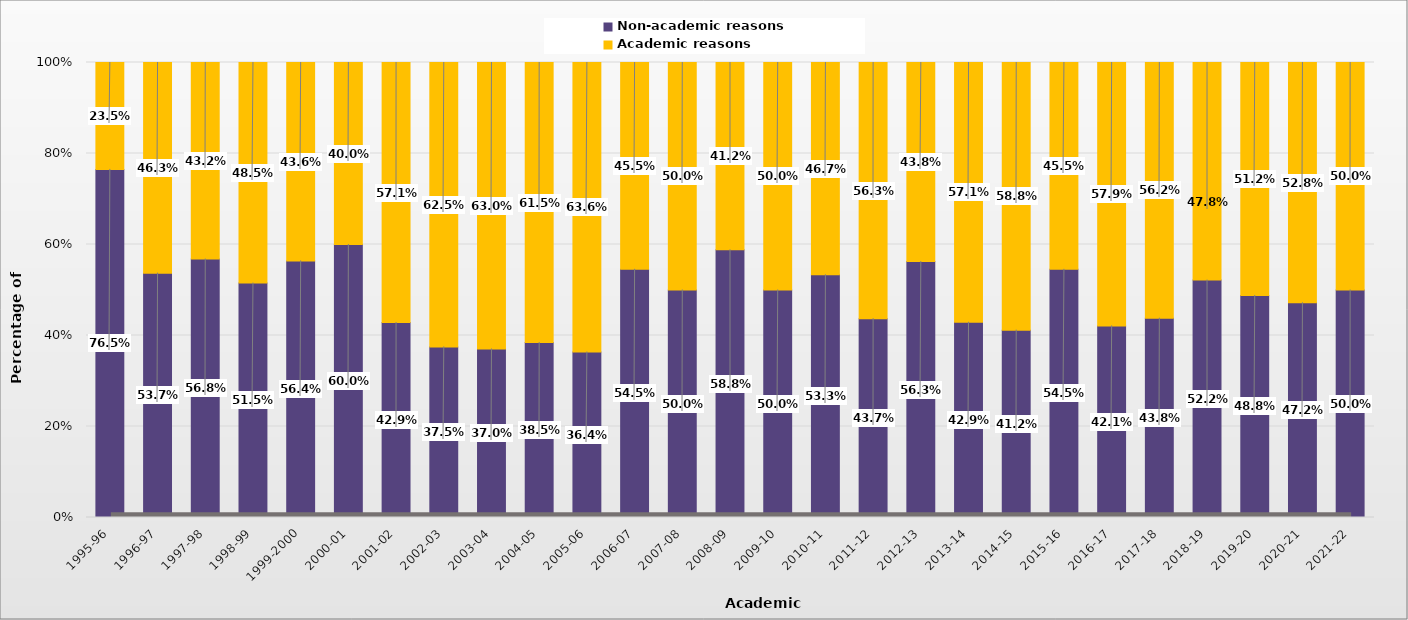
| Category | Non-academic reasons | Academic reasons |
|---|---|---|
| 1995-96 | 0.765 | 0.235 |
| 1996-97 | 0.537 | 0.463 |
| 1997-98 | 0.568 | 0.432 |
| 1998-99 | 0.515 | 0.485 |
| 1999-2000 | 0.564 | 0.436 |
| 2000-01 | 0.6 | 0.4 |
| 2001-02 | 0.429 | 0.571 |
| 2002-03 | 0.375 | 0.625 |
| 2003-04 | 0.37 | 0.63 |
| 2004-05 | 0.385 | 0.615 |
| 2005-06 | 0.364 | 0.636 |
| 2006-07 | 0.545 | 0.455 |
| 2007-08 | 0.5 | 0.5 |
| 2008-09 | 0.588 | 0.412 |
| 2009-10 | 0.5 | 0.5 |
| 2010-11 | 0.533 | 0.467 |
| 2011-12 | 0.437 | 0.563 |
| 2012-13 | 0.562 | 0.437 |
| 2013-14 | 0.429 | 0.571 |
| 2014-15 | 0.412 | 0.588 |
| 2015-16 | 0.545 | 0.455 |
| 2016-17 | 0.421 | 0.579 |
| 2017-18 | 0.438 | 0.562 |
| 2018-19 | 0.522 | 0.478 |
| 2019-20 | 0.488 | 0.512 |
| 2020-21 | 0.472 | 0.528 |
| 2021-22 | 0.5 | 0.5 |